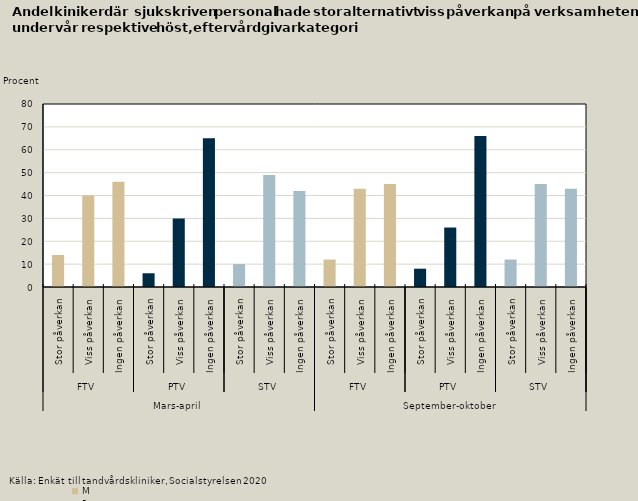
| Category | Sjukskriven personal |
|---|---|
| 0 | 14 |
| 1 | 40 |
| 2 | 46 |
| 3 | 6 |
| 4 | 30 |
| 5 | 65 |
| 6 | 10 |
| 7 | 49 |
| 8 | 42 |
| 9 | 12 |
| 10 | 43 |
| 11 | 45 |
| 12 | 8 |
| 13 | 26 |
| 14 | 66 |
| 15 | 12 |
| 16 | 45 |
| 17 | 43 |